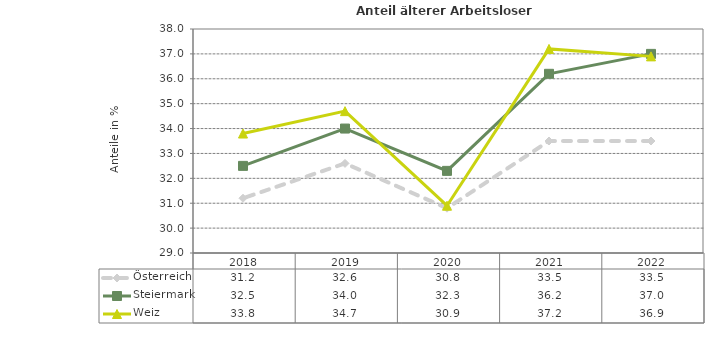
| Category | Österreich | Steiermark | Weiz |
|---|---|---|---|
| 2022.0 | 33.5 | 37 | 36.9 |
| 2021.0 | 33.5 | 36.2 | 37.2 |
| 2020.0 | 30.8 | 32.3 | 30.9 |
| 2019.0 | 32.6 | 34 | 34.7 |
| 2018.0 | 31.2 | 32.5 | 33.8 |